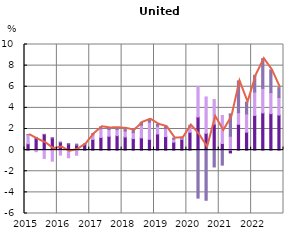
| Category | Unit labour costs | Unit profits | Unit taxes less subsidies |
|---|---|---|---|
| 2015.0 | 0.602 | 0.87 | 0.004 |
| nan | 1.195 | -0.15 | 0.01 |
| nan | 1.484 | -0.784 | 0.009 |
| nan | 1.135 | -1.045 | 0.048 |
| 2016.0 | 0.716 | -0.47 | 0.05 |
| nan | 0.584 | -0.722 | 0.029 |
| nan | 0.466 | -0.487 | 0.107 |
| nan | 0.517 | 0.017 | 0.065 |
| 2017.0 | 1.015 | 0.431 | 0.121 |
| nan | 1.198 | 0.831 | 0.182 |
| nan | 1.311 | 0.644 | 0.145 |
| nan | 1.367 | 0.581 | 0.171 |
| 2018.0 | 1.243 | 0.56 | 0.248 |
| nan | 1.09 | 0.569 | 0.239 |
| nan | 1.157 | 1.204 | 0.277 |
| nan | 1.023 | 1.626 | 0.274 |
| 2019.0 | 1.527 | 0.743 | 0.181 |
| nan | 1.279 | 0.759 | 0.187 |
| nan | 0.75 | 0.275 | 0.116 |
| nan | 1.028 | 0.114 | 0.032 |
| 2020.0 | 1.685 | 0.503 | 0.179 |
| nan | 3.134 | 2.897 | -4.541 |
| nan | 1.591 | 3.444 | -4.748 |
| nan | 2.462 | 2.325 | -1.596 |
| 2021.0 | 0.627 | 2.658 | -1.419 |
| nan | -0.265 | 1.316 | 2.119 |
| nan | 2.447 | 1.095 | 3.011 |
| nan | 1.702 | 1.722 | 1.123 |
| 2022.0 | 3.287 | 2.211 | 1.587 |
| nan | 3.524 | 2.324 | 2.815 |
| nan | 3.456 | 1.996 | 2.144 |
| nan | 3.321 | 1.659 | 0.939 |